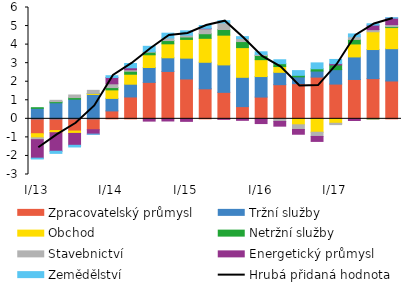
| Category | Zpracovatelský průmysl | Tržní služby | Obchod | Netržní služby  | Stavebnictví | Energetický průmysl | Zemědělství |
|---|---|---|---|---|---|---|---|
| I/13 | -0.802 | 0.565 | -0.222 | 0.034 | -0.098 | -0.997 | -0.045 |
| II | -0.633 | 0.867 | -0.115 | 0.061 | 0.07 | -0.999 | -0.115 |
| III | -0.658 | 1.06 | -0.128 | 0.084 | 0.141 | -0.641 | -0.09 |
|  IV | -0.588 | 1.314 | 0.053 | 0.002 | 0.166 | -0.238 | -0.006 |
| I/14 | 0.427 | 0.674 | 0.46 | 0.124 | 0.204 | 0.341 | 0.094 |
| II | 1.179 | 0.688 | 0.538 | 0.16 | 0.077 | 0.109 | 0.231 |
| III | 1.965 | 0.802 | 0.685 | 0.138 | 0.036 | -0.123 | 0.282 |
|  IV | 2.554 | 0.736 | 0.753 | 0.175 | 0.139 | -0.116 | 0.259 |
| I/15 | 2.148 | 1.123 | 1.009 | 0.13 | 0.1 | -0.136 | 0.232 |
| II | 1.617 | 1.431 | 1.292 | 0.247 | 0.266 | 0.027 | 0.152 |
| III | 1.427 | 1.48 | 1.603 | 0.304 | 0.356 | -0.025 | 0.121 |
| IV | 0.659 | 1.579 | 1.601 | 0.326 | 0.165 | -0.081 | 0.1 |
| I/16 | 1.173 | 1.106 | 0.91 | 0.223 | 0.06 | -0.255 | 0.14 |
| II | 1.841 | 0.666 | 0.311 | 0.154 | -0.139 | -0.256 | 0.211 |
| III | 1.895 | 0.365 | -0.321 | 0.084 | -0.252 | -0.257 | 0.254 |
| IV | 2.25 | 0.326 | -0.723 | 0.121 | -0.227 | -0.267 | 0.319 |
| I/17 | 1.873 | 0.778 | -0.24 | 0.253 | -0.072 | 0.071 | 0.225 |
| II | 2.122 | 1.215 | 0.701 | 0.242 | 0.147 | -0.089 | 0.15 |
| III | 2.168 | 1.567 | 0.958 | 0 | 0.113 | 0.245 | 0.074 |
| IV | 2.04 | 1.741 | 1.139 | 0.048 | 0.111 | 0.351 | 0.019 |